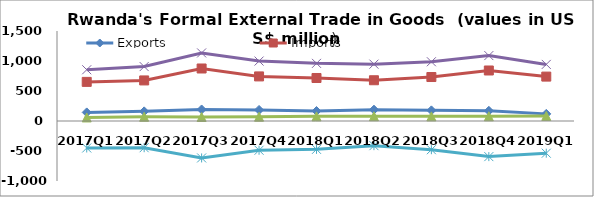
| Category | Exports | Imports | Re-Exports | Total Trade | Trade Balance |
|---|---|---|---|---|---|
| 2017Q1 | 143.077 | 651.996 | 59.162 | 854.234 | -449.757 |
| 2017Q2 | 160.66 | 676.27 | 70.307 | 907.238 | -445.303 |
| 2017Q3 | 192.175 | 875.018 | 67.195 | 1134.389 | -615.648 |
| 2017Q4 | 184.236 | 743.149 | 71.45 | 998.836 | -487.463 |
| 2018Q1 | 166.601 | 716.727 | 77.492 | 960.82 | -472.634 |
| 2018Q2 | 188.932 | 679.31 | 79.223 | 947.465 | -411.154 |
| 2018Q3 | 177.258 | 732.939 | 77.1 | 987.297 | -478.581 |
| 2018Q4 | 169.913 | 841.922 | 78.507 | 1090.342 | -593.501 |
| 2019Q1 | 118.717 | 739.974 | 84.641 | 943.332 | -536.617 |